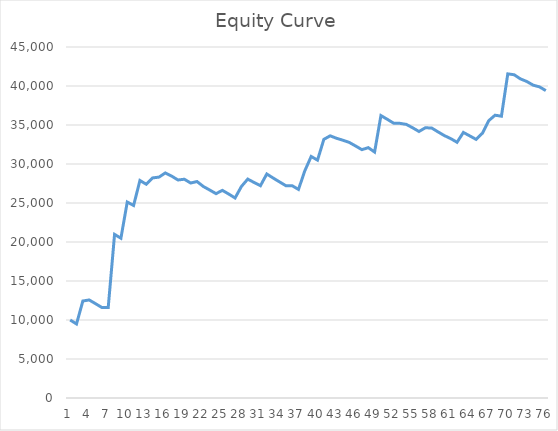
| Category | Equity |
|---|---|
| 0 | 10000 |
| 1 | 9492.4 |
| 2 | 12437.2 |
| 3 | 12572.6 |
| 4 | 12088.2 |
| 5 | 11600.4 |
| 6 | 11607.4 |
| 7 | 20977.4 |
| 8 | 20483.6 |
| 9 | 25123.2 |
| 10 | 24681.4 |
| 11 | 27884.6 |
| 12 | 27403.2 |
| 13 | 28218 |
| 14 | 28316.35 |
| 15 | 28857.55 |
| 16 | 28447.15 |
| 17 | 27950.8 |
| 18 | 28046.8 |
| 19 | 27562.2 |
| 20 | 27752.4 |
| 21 | 27115.6 |
| 22 | 26665.6 |
| 23 | 26200.6 |
| 24 | 26618.2 |
| 25 | 26150.2 |
| 26 | 25642.7 |
| 27 | 27116.45 |
| 28 | 28064.25 |
| 29 | 27630.45 |
| 30 | 27215.1 |
| 31 | 28718.7 |
| 32 | 28204.2 |
| 33 | 27710.2 |
| 34 | 27221.6 |
| 35 | 27216.85 |
| 36 | 26740.85 |
| 37 | 29133.05 |
| 38 | 30964.05 |
| 39 | 30496.45 |
| 40 | 33162.25 |
| 41 | 33610.8 |
| 42 | 33297.35 |
| 43 | 33049.3 |
| 44 | 32767 |
| 45 | 32311.25 |
| 46 | 31836.85 |
| 47 | 32099.1 |
| 48 | 31534.5 |
| 49 | 36209.25 |
| 50 | 35729.85 |
| 51 | 35236.05 |
| 52 | 35211.25 |
| 53 | 35079.65 |
| 54 | 34642.85 |
| 55 | 34169.45 |
| 56 | 34643.65 |
| 57 | 34616.05 |
| 58 | 34119.05 |
| 59 | 33641.45 |
| 60 | 33257.3 |
| 61 | 32784.3 |
| 62 | 34046.1 |
| 63 | 33606.9 |
| 64 | 33157.9 |
| 65 | 33944.7 |
| 66 | 35557.5 |
| 67 | 36257.5 |
| 68 | 36127.15 |
| 69 | 41556.65 |
| 70 | 41442.45 |
| 71 | 40911.85 |
| 72 | 40577.05 |
| 73 | 40108.75 |
| 74 | 39888.4 |
| 75 | 39410.8 |